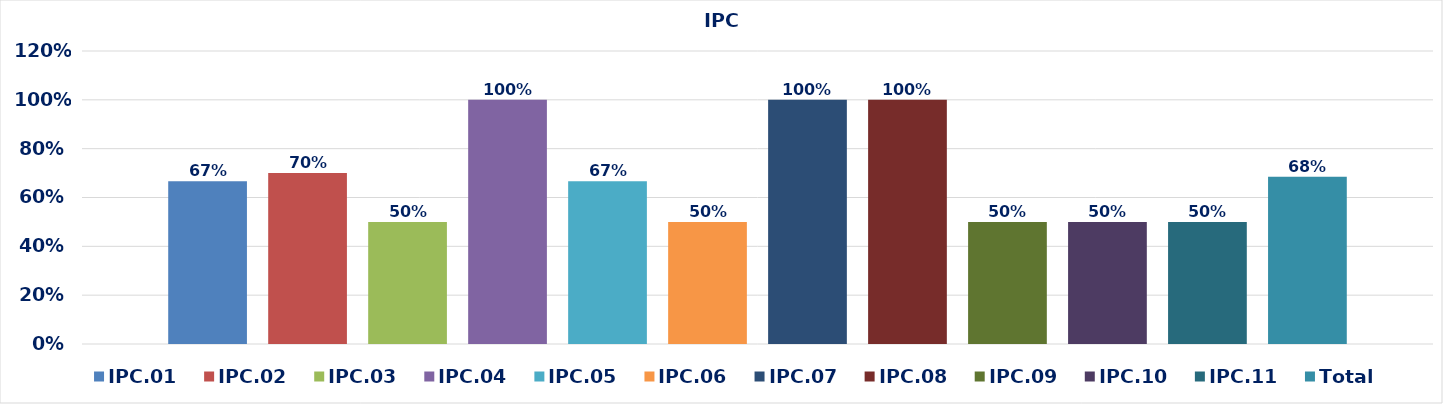
| Category | IPC.01 | IPC.02 | IPC.03 | IPC.04 | IPC.05 | IPC.06 | IPC.07 | IPC.08 | IPC.09 | IPC.10 | IPC.11 | Total |
|---|---|---|---|---|---|---|---|---|---|---|---|---|
| 0 | 0.667 | 0.7 | 0.5 | 1 | 0.667 | 0.5 | 1 | 1 | 0.5 | 0.5 | 0.5 | 0.685 |